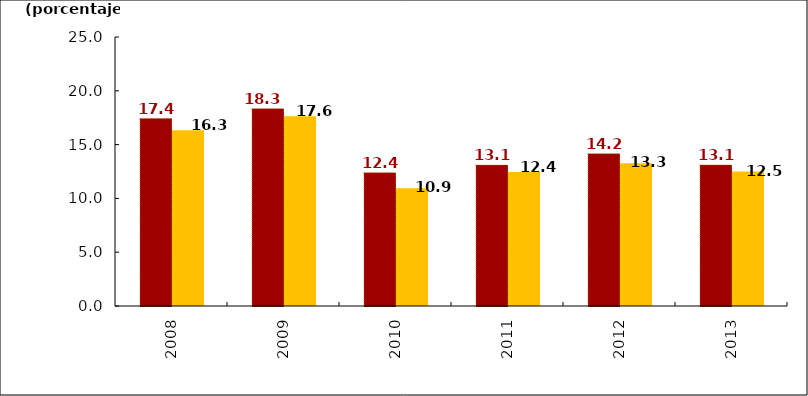
| Category | Participación base frágiles despúes del choque | Participación base frágiles antes del choque |
|---|---|---|
| 2008.0 | 17.426 | 16.332 |
| 2009.0 | 18.339 | 17.643 |
| 2010.0 | 12.39 | 10.936 |
| 2011.0 | 13.093 | 12.444 |
| 2012.0 | 14.159 | 13.258 |
| 2013.0 | 13.109 | 12.489 |